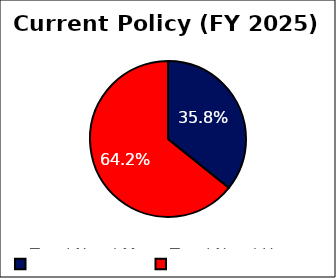
| Category | Current
Policy |
|---|---|
| Total Need Met | 0.358 |
| Total Need Unmet | 0.642 |